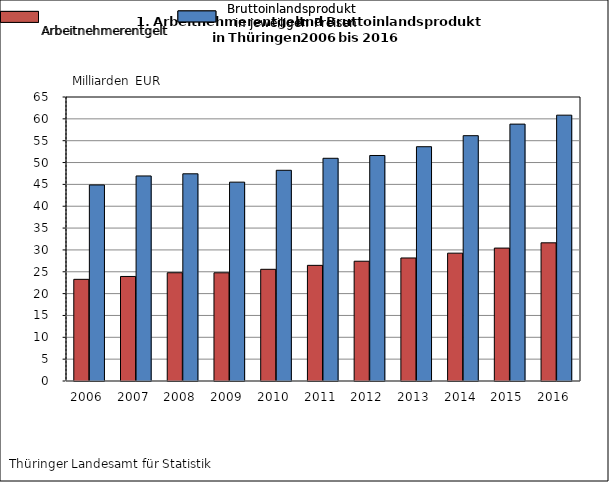
| Category | Arbeitnehmer-
entgelt | Bruttoinlands-
produkt |
|---|---|---|
| 2006.0 | 23.268 | 44.869 |
| 2007.0 | 23.924 | 46.928 |
| 2008.0 | 24.779 | 47.423 |
| 2009.0 | 24.768 | 45.513 |
| 2010.0 | 25.564 | 48.225 |
| 2011.0 | 26.467 | 50.972 |
| 2012.0 | 27.412 | 51.612 |
| 2013.0 | 28.155 | 53.622 |
| 2014.0 | 29.257 | 56.146 |
| 2015.0 | 30.421 | 58.793 |
| 2016.0 | 31.625 | 60.843 |